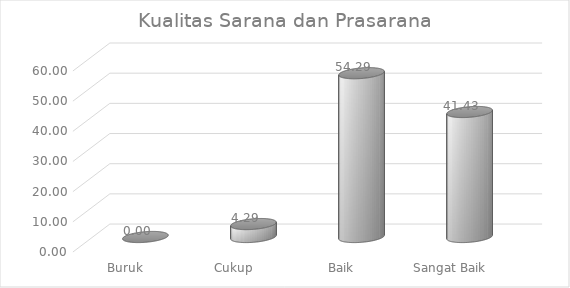
| Category | Penanganan Pengaduan |
|---|---|
| Buruk | 0 |
| Cukup | 4.286 |
| Baik | 54.286 |
| Sangat Baik | 41.429 |